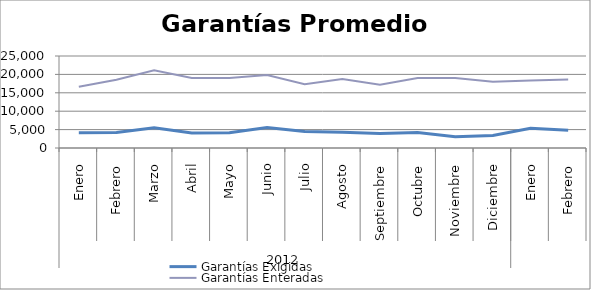
| Category | Garantías Exigidas | Garantías Enteradas |
|---|---|---|
| 0 | 4146.8 | 16662.483 |
| 1 | 4190.531 | 18572.749 |
| 2 | 5482.211 | 21128.648 |
| 3 | 4079.038 | 18997.51 |
| 4 | 4141.554 | 19005.364 |
| 5 | 5549.139 | 19818.91 |
| 6 | 4487.023 | 17351.39 |
| 7 | 4277.924 | 18719.955 |
| 8 | 3940.893 | 17217.403 |
| 9 | 4180.69 | 19046.939 |
| 10 | 3056.997 | 19028.425 |
| 11 | 3426.799 | 17994.819 |
| 12 | 5390.461 | 18317.043 |
| 13 | 4807.91 | 18608.477 |